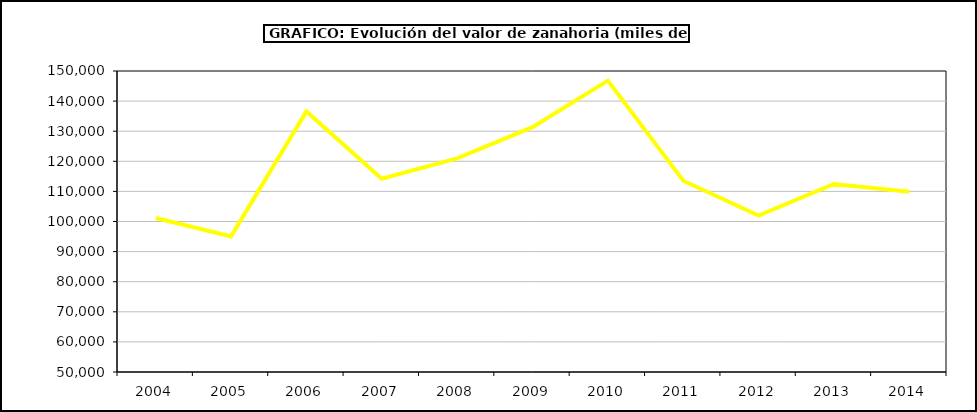
| Category | Valor |
|---|---|
| 2004.0 | 101160.56 |
| 2005.0 | 95063.644 |
| 2006.0 | 136581.569 |
| 2007.0 | 114230.439 |
| 2008.0 | 120953.143 |
| 2009.0 | 131354.206 |
| 2010.0 | 146811.606 |
| 2011.0 | 113537.975 |
| 2012.0 | 101980.864 |
| 2013.0 | 112485.085 |
| 2014.0 | 109919.203 |